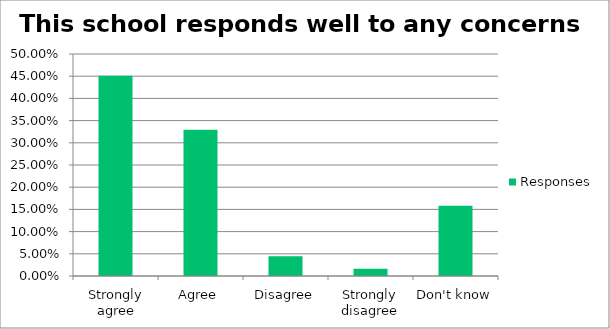
| Category | Responses |
|---|---|
| Strongly agree | 0.451 |
| Agree | 0.329 |
| Disagree | 0.045 |
| Strongly disagree | 0.016 |
| Don't know | 0.158 |